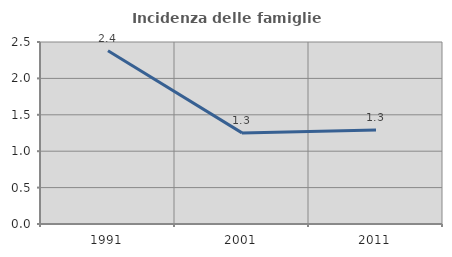
| Category | Incidenza delle famiglie numerose |
|---|---|
| 1991.0 | 2.38 |
| 2001.0 | 1.252 |
| 2011.0 | 1.292 |